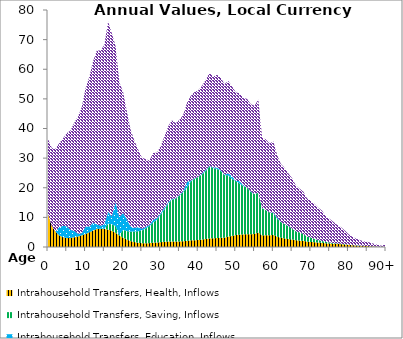
| Category | Intrahousehold Transfers, Health, Inflows | Intrahousehold Transfers, Saving, Inflows | Intrahousehold Transfers, Education, Inflows | Intrahousehold Transfers, Consumption other than health and education, Inflows |
|---|---|---|---|---|
| 0 | 11136.586 | 0 | 0 | 25314.452 |
|  | 7125.473 | 0 | 0 | 26287.497 |
| 2 | 5211.992 | 0 | 0 | 27942.4 |
| 3 | 3918.377 | 0 | 2850.135 | 28293.094 |
| 4 | 3292.663 | 0 | 3819.312 | 29556.372 |
| 5 | 3080.13 | 0 | 3927.662 | 31419.345 |
| 6 | 3075.153 | 0 | 2708.944 | 33594.099 |
| 7 | 3287.367 | 0 | 2136.845 | 36566.761 |
| 8 | 3562.61 | 0 | 924.18 | 39573.559 |
| 9 | 3920.944 | 0 | 728.638 | 42627.45 |
| 10 | 4395.606 | 0 | 2547.938 | 46563.467 |
| 11 | 4946.808 | 0 | 1943.592 | 50507.387 |
| 12 | 5539.186 | 0 | 2593.988 | 54541.466 |
| 13 | 6127.549 | 0 | 1527.69 | 58690.03 |
| 14 | 6159.702 | 0 | 1001.489 | 59136.586 |
| 15 | 6110.936 | 0 | 1549.331 | 60577.873 |
| 16 | 5881.648 | 2023.962 | 4020.422 | 64158.037 |
| 17 | 5457.074 | 2169.494 | 2707.568 | 61775.349 |
| 18 | 4777.201 | 2327.91 | 8028.86 | 52666.474 |
| 19 | 3864.259 | 0 | 6225.712 | 45502.871 |
| 20 | 3155.819 | 2649.25 | 5680.466 | 40806.31 |
| 21 | 2505.35 | 2876.369 | 4016.341 | 36336.479 |
| 22 | 2009.943 | 3158.91 | 1719.605 | 32690.225 |
| 23 | 1663.129 | 3575.039 | 1213.881 | 29430.331 |
| 24 | 1418.361 | 3883.319 | 1428.644 | 26173.709 |
| 25 | 1292.631 | 4257.992 | 591.807 | 24042.668 |
| 26 | 1262.105 | 4986.636 | 536.399 | 22855.308 |
| 27 | 1296.587 | 5737.164 | 376.269 | 21812.321 |
| 28 | 1475.642 | 6829.576 | 826.937 | 22636.708 |
| 29 | 1515.899 | 7706.017 | 528.634 | 22038.496 |
| 30 | 1627.1 | 9318.791 | 424.034 | 22679.503 |
| 31 | 1758.148 | 10932.395 | 592.809 | 23976.829 |
| 32 | 1862.671 | 12695.402 | 452.094 | 25724.965 |
| 33 | 1887.197 | 14132.645 | 240.071 | 26506.538 |
| 34 | 1833.508 | 14446.04 | 158.246 | 25357.935 |
| 35 | 1890.763 | 15426.53 | 249.862 | 25347.678 |
| 36 | 1941.183 | 16598.588 | 255.21 | 25802.57 |
| 37 | 2053.223 | 18004.834 | 1928.02 | 26671.494 |
| 38 | 2243.116 | 19832.624 | 288.601 | 28624.226 |
| 39 | 2301.175 | 20710.556 | 173.403 | 29149.722 |
| 40 | 2338.822 | 21259.599 | 50.398 | 29225.391 |
| 41 | 2508.11 | 21974.701 | 259.771 | 29640.581 |
| 42 | 2703.486 | 22945.711 | 339.014 | 30460.841 |
| 43 | 2907.248 | 24251.71 | 204.489 | 31423.128 |
| 44 | 2921.11 | 23708.933 | 197.203 | 30684.045 |
| 45 | 3046.737 | 23314.707 | 556.462 | 31199.698 |
| 46 | 3107.177 | 22546.935 | 243.027 | 31224.766 |
| 47 | 3162.376 | 21105.105 | 137.425 | 30568.522 |
| 48 | 3526.494 | 20647.84 | 690.491 | 31189.65 |
| 49 | 3742.51 | 19232.912 | 974.527 | 30278.526 |
| 50 | 4021.332 | 18207.095 | 128.335 | 29866.37 |
| 51 | 4179.109 | 17254.929 | 777.608 | 29644.12 |
| 52 | 4262.814 | 16277.494 | 277.693 | 29443.403 |
| 53 | 4345.587 | 15761.704 | 73.169 | 29836.662 |
| 54 | 4303.962 | 14276.455 | 200.038 | 29415.185 |
| 55 | 4414.196 | 13403.875 | 73.208 | 29787.243 |
| 56 | 4903.684 | 13392.936 | 54.857 | 31453.524 |
| 57 | 3885.054 | 9197.698 | 102.974 | 23721.103 |
| 58 | 4011.51 | 8426.563 | 54.772 | 23811.9 |
| 59 | 3958.198 | 7614.895 | 64.771 | 23318.325 |
| 60 | 4062.811 | 7388.495 | 242.53 | 23929.175 |
| 61 | 3496.953 | 6082.498 | 413.639 | 21119.18 |
| 62 | 3119.335 | 5307.785 | 48.745 | 19577.172 |
| 63 | 2905.182 | 4843.083 | 25.797 | 18931.005 |
| 64 | 2680.799 | 4319.306 | 87.947 | 17762.367 |
| 65 | 2532.876 | 3674.094 | 14.444 | 16989.504 |
| 66 | 2283.836 | 2991.958 | 5.549 | 15476.405 |
| 67 | 2152.217 | 2761.977 | 29.342 | 14730.606 |
| 68 | 2070.983 | 2305.114 | 14.159 | 14275.694 |
| 69 | 1816.33 | 1715.7 | 6.258 | 12810.683 |
| 70 | 1714.25 | 1430.048 | 7.614 | 12412.265 |
| 71 | 1609.943 | 1107.091 | 19.962 | 11784.322 |
| 72 | 1495.46 | 818.497 | 20.846 | 10921.16 |
| 73 | 1406.794 | 641.854 | 12.278 | 10158.596 |
| 74 | 1235.818 | 467.799 | 2.938 | 8651.706 |
| 75 | 1174.823 | 353.859 | 1.85 | 7927.03 |
| 76 | 1088.971 | 259.56 | 4.754 | 7134.401 |
| 77 | 1008.248 | 181.667 | 9.698 | 6243.291 |
| 78 | 960.15 | 131.087 | 4.602 | 5617.563 |
| 79 | 844.98 | 100.051 | 42.706 | 4607.633 |
| 80 | 715.745 | 81.422 | 5.601 | 3562.172 |
| 81 | 602.271 | 68.49 | 0.184 | 2786.265 |
| 82 | 503.136 | 59.162 | 6.045 | 2265.594 |
| 83 | 419.318 | 53.985 | 66.516 | 1828.62 |
| 84 | 354.117 | 43.98 | 0 | 1506.173 |
| 85 | 319.285 | 39.083 | 0.111 | 1398.6 |
| 86 | 245.904 | 33.294 | 0.122 | 1107.887 |
| 87 | 164.821 | 30.596 | 1.859 | 786.694 |
| 88 | 95.176 | 30.454 | 8.102 | 525.646 |
| 89 | 43.525 | 29.717 | 0 | 329.965 |
| 90+ | 88.348 | 128.708 | 0 | 1034.168 |